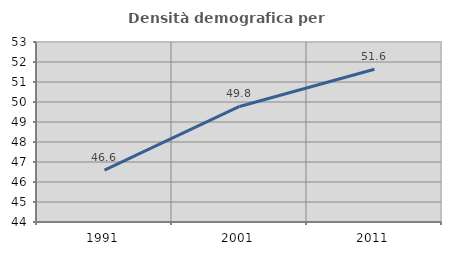
| Category | Densità demografica |
|---|---|
| 1991.0 | 46.591 |
| 2001.0 | 49.777 |
| 2011.0 | 51.635 |